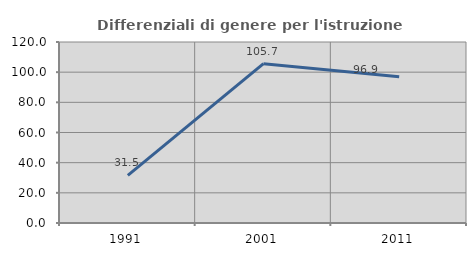
| Category | Differenziali di genere per l'istruzione superiore |
|---|---|
| 1991.0 | 31.541 |
| 2001.0 | 105.658 |
| 2011.0 | 96.94 |